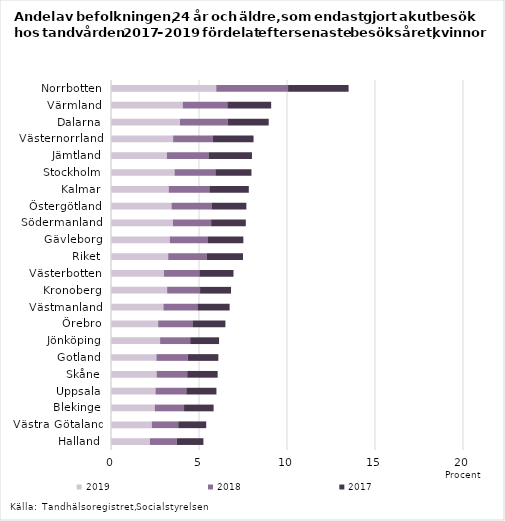
| Category | 2019 | 2018 | 2017 |
|---|---|---|---|
| Halland | 2.21 | 1.53 | 1.51 |
| Västra Götaland | 2.32 | 1.5 | 1.59 |
| Blekinge | 2.49 | 1.66 | 1.68 |
| Uppsala | 2.53 | 1.75 | 1.71 |
| Skåne | 2.59 | 1.74 | 1.73 |
| Gotland | 2.58 | 1.78 | 1.74 |
| Jönköping | 2.79 | 1.71 | 1.64 |
| Örebro | 2.68 | 1.95 | 1.87 |
| Västmanland | 2.98 | 1.93 | 1.83 |
| Kronoberg | 3.19 | 1.87 | 1.76 |
| Västerbotten | 3.01 | 2.01 | 1.94 |
| Riket | 3.25 | 2.18 | 2.07 |
| Gävleborg | 3.34 | 2.14 | 2.04 |
| Södermanland | 3.52 | 2.17 | 1.97 |
| Östergötland | 3.44 | 2.27 | 1.98 |
| Kalmar | 3.28 | 2.31 | 2.24 |
| Stockholm | 3.61 | 2.32 | 2.05 |
| Jämtland | 3.18 | 2.36 | 2.47 |
| Västernorrland | 3.53 | 2.26 | 2.31 |
| Dalarna | 3.92 | 2.71 | 2.33 |
| Värmland | 4.08 | 2.53 | 2.49 |
| Norrbotten | 5.98 | 4.08 | 3.44 |